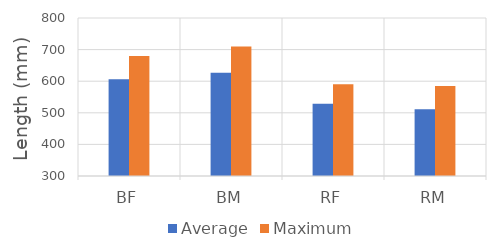
| Category | Average | Maximum |
|---|---|---|
| BF | 606.124 | 680 |
| BM | 626.747 | 710 |
| RF | 528.83 | 590 |
| RM | 511.544 | 585 |